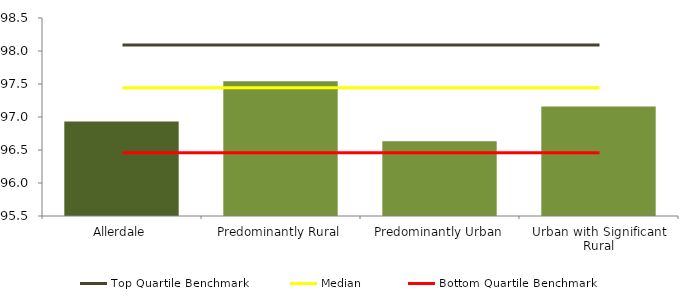
| Category | Series 0 |
|---|---|
| Allerdale | 96.93 |
| Predominantly Rural | 97.54 |
| Predominantly Urban | 96.634 |
| Urban with Significant Rural | 97.158 |